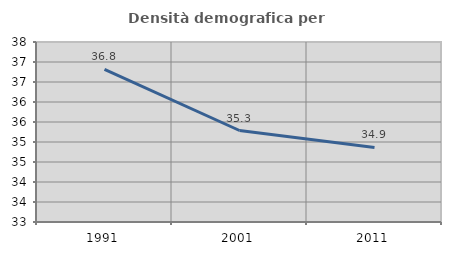
| Category | Densità demografica |
|---|---|
| 1991.0 | 36.814 |
| 2001.0 | 35.287 |
| 2011.0 | 34.863 |